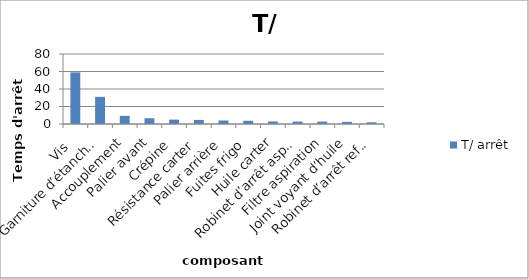
| Category | T/ arrêt |
|---|---|
| Vis  | 59 |
| Garniture d’étanchéité | 31 |
| Accouplement | 9.333 |
| Palier avant | 6.591 |
| Crépine | 5 |
| Résistance carter | 4.643 |
| Palier arrière | 4 |
| Fuites frigo | 3.667 |
| Huile carter | 2.9 |
| Robinet d’arrêt aspiration | 2.792 |
| Filtre aspiration | 2.75 |
| Joint voyant d’huile | 2.5 |
| Robinet d’arrêt refoulement | 1.979 |